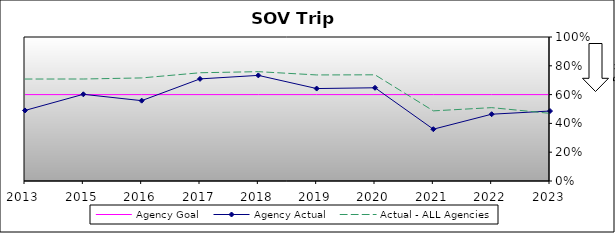
| Category | Agency Goal | Agency Actual | Actual - ALL Agencies |
|---|---|---|---|
| 2013.0 | 0.6 | 0.49 | 0.708 |
| 2015.0 | 0.6 | 0.602 | 0.708 |
| 2016.0 | 0.6 | 0.558 | 0.716 |
| 2017.0 | 0.6 | 0.709 | 0.752 |
| 2018.0 | 0.6 | 0.734 | 0.759 |
| 2019.0 | 0.6 | 0.642 | 0.736 |
| 2020.0 | 0.6 | 0.647 | 0.737 |
| 2021.0 | 0.6 | 0.36 | 0.487 |
| 2022.0 | 0.6 | 0.464 | 0.509 |
| 2023.0 | 0.6 | 0.486 | 0.47 |